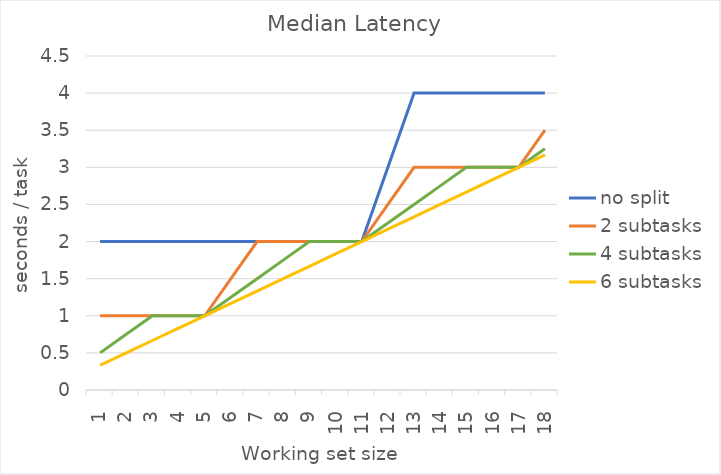
| Category | no split | 2 subtasks | 4 subtasks | 6 subtasks |
|---|---|---|---|---|
| 1.0 | 2 | 1 | 0.5 | 0.333 |
| 2.0 | 2 | 1 | 0.75 | 0.5 |
| 3.0 | 2 | 1 | 1 | 0.667 |
| 4.0 | 2 | 1 | 1 | 0.833 |
| 5.0 | 2 | 1 | 1 | 1 |
| 6.0 | 2 | 1.5 | 1.25 | 1.167 |
| 7.0 | 2 | 2 | 1.5 | 1.333 |
| 8.0 | 2 | 2 | 1.75 | 1.5 |
| 9.0 | 2 | 2 | 2 | 1.667 |
| 10.0 | 2 | 2 | 2 | 1.833 |
| 11.0 | 2 | 2 | 2 | 2 |
| 12.0 | 3 | 2.5 | 2.25 | 2.167 |
| 13.0 | 4 | 3 | 2.5 | 2.333 |
| 14.0 | 4 | 3 | 2.75 | 2.5 |
| 15.0 | 4 | 3 | 3 | 2.667 |
| 16.0 | 4 | 3 | 3 | 2.833 |
| 17.0 | 4 | 3 | 3 | 3 |
| 18.0 | 4 | 3.5 | 3.25 | 3.167 |